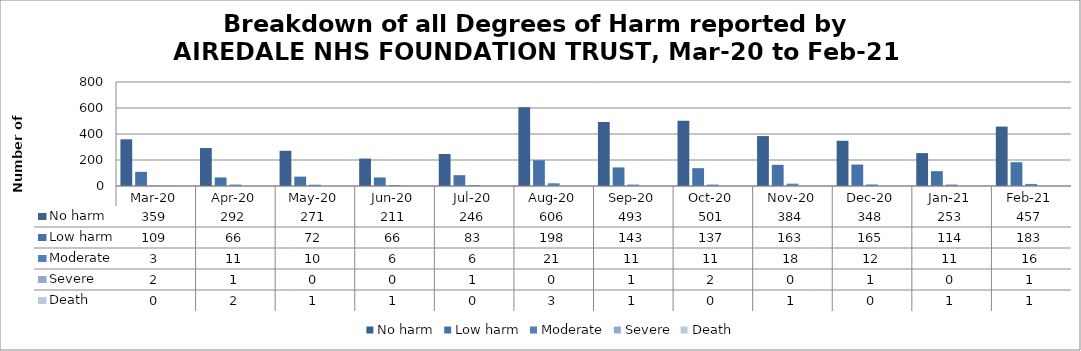
| Category | No harm | Low harm | Moderate | Severe | Death |
|---|---|---|---|---|---|
| Mar-20 | 359 | 109 | 3 | 2 | 0 |
| Apr-20 | 292 | 66 | 11 | 1 | 2 |
| May-20 | 271 | 72 | 10 | 0 | 1 |
| Jun-20 | 211 | 66 | 6 | 0 | 1 |
| Jul-20 | 246 | 83 | 6 | 1 | 0 |
| Aug-20 | 606 | 198 | 21 | 0 | 3 |
| Sep-20 | 493 | 143 | 11 | 1 | 1 |
| Oct-20 | 501 | 137 | 11 | 2 | 0 |
| Nov-20 | 384 | 163 | 18 | 0 | 1 |
| Dec-20 | 348 | 165 | 12 | 1 | 0 |
| Jan-21 | 253 | 114 | 11 | 0 | 1 |
| Feb-21 | 457 | 183 | 16 | 1 | 1 |